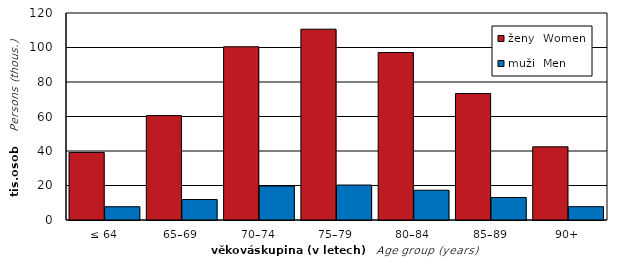
| Category | ženy  Women | muži  Men |
|---|---|---|
| ≤ 64 | 39179 | 7697 |
| 65–69 | 60533 | 11863 |
| 70–74 | 100427 | 19705 |
| 75–79 | 110621 | 20271 |
| 80–84 | 97113 | 17248 |
| 85–89 | 73324 | 13050 |
| 90+ | 42427 | 7718 |